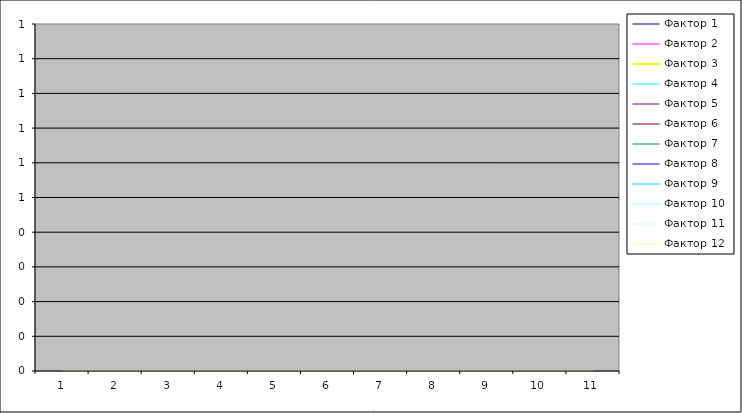
| Category | Фактор 1 | Фактор 2 | Фактор 3 | Фактор 4 | Фактор 5 | Фактор 6 | Фактор 7 | Фактор 8 | Фактор 9 | Фактор 10 | Фактор 11 | Фактор 12 |
|---|---|---|---|---|---|---|---|---|---|---|---|---|
| 0 | 0 | 0 | 0 | 0 | 0 | 0 | 0 | 0 | 0 | 0 | 0 | 0 |
| 1 | 0 | 0 | 0 | 0 | 0 | 0 | 0 | 0 | 0 | 0 | 0 | 0 |
| 2 | 0 | 0 | 0 | 0 | 0 | 0 | 0 | 0 | 0 | 0 | 0 | 0 |
| 3 | 0 | 0 | 0 | 0 | 0 | 0 | 0 | 0 | 0 | 0 | 0 | 0 |
| 4 | 0 | 0 | 0 | 0 | 0 | 0 | 0 | 0 | 0 | 0 | 0 | 0 |
| 5 | 0 | 0 | 0 | 0 | 0 | 0 | 0 | 0 | 0 | 0 | 0 | 0 |
| 6 | 0 | 0 | 0 | 0 | 0 | 0 | 0 | 0 | 0 | 0 | 0 | 0 |
| 7 | 0 | 0 | 0 | 0 | 0 | 0 | 0 | 0 | 0 | 0 | 0 | 0 |
| 8 | 0 | 0 | 0 | 0 | 0 | 0 | 0 | 0 | 0 | 0 | 0 | 0 |
| 9 | 0 | 0 | 0 | 0 | 0 | 0 | 0 | 0 | 0 | 0 | 0 | 0 |
| 10 | 0 | 0 | 0 | 0 | 0 | 0 | 0 | 0 | 0 | 0 | 0 | 0 |